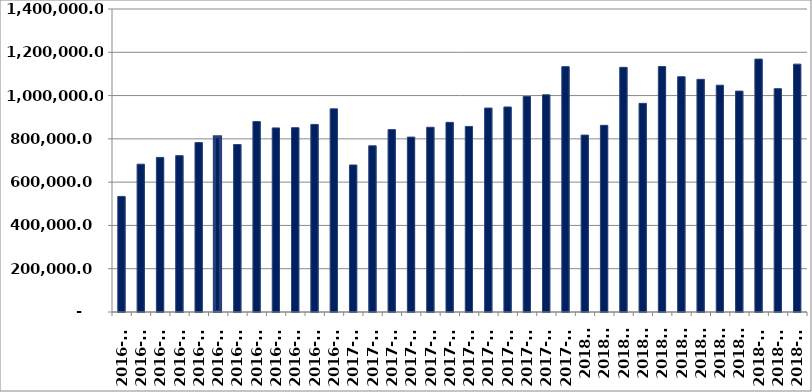
| Category | საქონლით საგარეო ვაჭრობა სულ |
|---|---|
| 2016-01 | 534063.371 |
| 2016-02 | 682998.151 |
| 2016-03 | 714259.49 |
| 2016-04 | 722513.461 |
| 2016-05 | 782805.836 |
| 2016-06 | 810296.193 |
| 2016-07 | 773647.372 |
| 2016-08 | 879835.97 |
| 2016-09 | 850597.611 |
| 2016-10 | 851493.027 |
| 2016-11 | 866668.983 |
| 2016-12 | 938736.746 |
| 2017-01 | 679232.869 |
| 2017-02 | 767893.86 |
| 2017-03 | 842676.087 |
| 2017-04 | 808010.098 |
| 2017-05 | 853533.974 |
| 2017-06 | 876280.688 |
| 2017-07 | 857256.002 |
| 2017-08 | 942318.449 |
| 2017-09 | 947275.546 |
| 2017-10 | 995833.568 |
| 2017-11 | 1003532.659 |
| 2017-12 | 1133562.659 |
| 2018-1 | 817337.351 |
| 2018-2 | 862568.316 |
| 2018-3 | 1130543.909 |
| 2018-4 | 964025.797 |
| 2018-5 | 1133991.664 |
| 2018-6 | 1087059.518 |
| 2018-7 | 1075002.59 |
| 2018-8 | 1047800.484 |
| 2018-9 | 1020616.524 |
| 2018-10 | 1168412.469 |
| 2018-11 | 1031812.317 |
| 2018-12 | 1145225.835 |